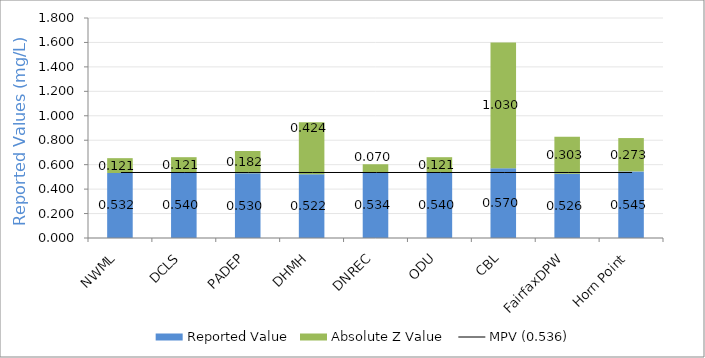
| Category | Reported Value | Absolute Z Value  |
|---|---|---|
| NWML | 0.532 | 0.121 |
| DCLS | 0.54 | 0.121 |
| PADEP | 0.53 | 0.182 |
| DHMH | 0.522 | 0.424 |
| DNREC | 0.534 | 0.07 |
| ODU | 0.54 | 0.121 |
| CBL | 0.57 | 1.03 |
| FairfaxDPW | 0.526 | 0.303 |
| Horn Point | 0.545 | 0.273 |